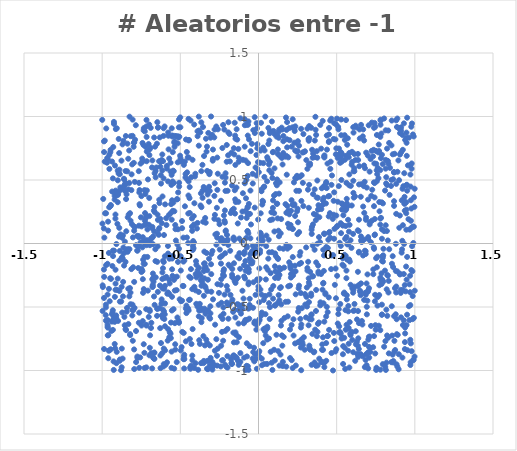
| Category | Y |
|---|---|
| 0.8964167657701791 | -0.99 |
| 0.5824913958309657 | 0.147 |
| -0.10274675420012946 | -0.372 |
| 0.3691181538297885 | -0.149 |
| 0.28324670696125986 | -0.799 |
| -0.22171421234348498 | 0.003 |
| 0.34918489653656937 | 0.389 |
| -0.17051188895530744 | -0.459 |
| 0.9238952145326706 | -0.642 |
| -0.2822801752314581 | 0.375 |
| 0.8907044855774 | -0.72 |
| -0.8305976686521073 | 0.227 |
| -0.8409951767035069 | -0.507 |
| -0.807322820931881 | -0.567 |
| 0.32517920160419833 | -0.822 |
| 0.3483666643932861 | 0.15 |
| 0.18859269846408022 | 0.155 |
| 0.41249743487753876 | -0.739 |
| -0.7141899433687766 | 0.418 |
| 0.6187244401403211 | -0.924 |
| 0.3759309111390634 | 0.675 |
| -0.9930883082792661 | 0.351 |
| 0.6491729342163812 | -0.372 |
| -0.08356164736692451 | -0.138 |
| 0.9300679211641962 | 0.946 |
| -0.6315652358383388 | 0.835 |
| 0.48222065649139334 | -0.704 |
| 0.6133080096440979 | 0.569 |
| 0.3667051522160789 | -0.961 |
| 0.2035934603628089 | -0.182 |
| -0.5369673955765399 | 0.804 |
| 0.8786831464304732 | -0.002 |
| 0.883196828299736 | -0.951 |
| 0.2591799225699525 | 0.77 |
| -0.013596083525351244 | -0.678 |
| 0.5504688796966977 | -0.089 |
| -0.12651882503492629 | 0.644 |
| -0.9883009623744117 | -0.429 |
| 0.11070303346926358 | -0.098 |
| -0.07887533704441974 | 0.043 |
| -0.3742973551315738 | -0.51 |
| -0.4843319749107293 | -0.334 |
| 0.0725126760214021 | 0.868 |
| -0.07067640993851287 | 0.098 |
| 0.5370403599780624 | -0.166 |
| 0.605317040131907 | 0.076 |
| -0.12514234186607442 | -0.738 |
| -0.08646866079407567 | -0.275 |
| 0.9456056375305006 | 0.832 |
| 0.39511078589696513 | 0.934 |
| 0.38011067176742674 | 0.36 |
| 0.6698182500527532 | 0.898 |
| -0.9583727843412482 | -0.844 |
| 0.8503405297641415 | 0.5 |
| 0.8504889129323194 | 0.772 |
| 0.774221274463414 | 0.253 |
| -0.3162615292680615 | -0.12 |
| -0.48768610515749744 | -0.696 |
| -0.9549618778805946 | 0.285 |
| -0.3579383095247284 | 0.36 |
| -0.5499325939312683 | -0.255 |
| -0.5327327922374776 | -0.793 |
| -0.3388243723242108 | -0.553 |
| 0.6434961169008853 | -0.326 |
| 0.10183523932162242 | 0.095 |
| -0.5627692674530562 | -0.71 |
| -0.6340711962837107 | 0.122 |
| 0.15835578605192557 | 0.712 |
| -0.025094971917935638 | -0.08 |
| 0.7804648364997802 | 0.935 |
| -0.9487728963605064 | -0.273 |
| 0.6853964652447091 | -0.061 |
| 0.337240819925559 | 0.911 |
| 0.6317514238363173 | -0.869 |
| -0.7928095482513646 | -0.507 |
| -0.2926758793260462 | 0.652 |
| -0.6639568523584924 | 0.248 |
| -0.5971916382437978 | 0.308 |
| -0.6615615750117056 | 0.763 |
| -0.15849107907487747 | 0.274 |
| 0.007335839017932777 | -0.895 |
| 0.9627912551954012 | 0.834 |
| -0.7543966712906305 | 0.629 |
| -0.84393747633777 | 0.387 |
| -0.10287083286972387 | 0.252 |
| 0.9717009858263721 | -0.957 |
| -0.6434490514446245 | 0.186 |
| 0.1392276410030775 | 0.686 |
| 0.027044977451173846 | 0.024 |
| 0.48063971328940847 | 0.336 |
| -0.32096948367387856 | 0.871 |
| 0.5264749523966377 | -0.019 |
| -0.679641614383711 | 0.045 |
| 0.043442350205074254 | 0.999 |
| 0.06955037132103636 | -0.401 |
| 0.6765241224971563 | 0.241 |
| 0.7628542961505342 | 0.595 |
| 0.24908498842640525 | 0.073 |
| -0.6144139100303507 | -0.354 |
| 0.9223219745454649 | -0.365 |
| 0.3246211734815636 | 0.83 |
| 0.8740951566173507 | -0.839 |
| 0.5193859741150035 | 0.707 |
| 0.28732604027799913 | 0.862 |
| 0.25016039747670815 | 0.274 |
| -0.02397805202246972 | 0.282 |
| -0.06164986680811246 | 0.312 |
| 0.9672042898750175 | 0.11 |
| -0.6225131078402659 | 0.647 |
| 0.49779177937294516 | 0.749 |
| -0.056129465928743016 | -0.436 |
| 0.7523059521893796 | -0.116 |
| -0.5607057680837213 | -0.745 |
| 0.4019824148962772 | 0.271 |
| -0.6112983400584597 | -0.587 |
| 0.8315385610899886 | 0.627 |
| -0.6682483755685384 | -0.417 |
| -0.9540866247145692 | 0.698 |
| 0.6070887278583763 | 0.398 |
| 0.5547149608127939 | -0.988 |
| -0.46722693092133905 | 0.52 |
| 0.12222496752826828 | 0.198 |
| -0.3227080197566423 | -0.526 |
| -0.644663355965515 | -0.023 |
| -0.8185900556492052 | -0.478 |
| 0.23706140394374398 | -0.219 |
| 0.0065282399922172996 | -0.604 |
| -0.2399216684978842 | 0.337 |
| 0.931393501804419 | -0.003 |
| -0.8187582792241554 | -0.387 |
| 0.9095538126255538 | -0.365 |
| 0.3213492444182797 | 0.622 |
| -0.03455759665608826 | -0.506 |
| -0.24049605730190038 | 0.019 |
| 0.3392455855923253 | -0.597 |
| -0.6884425320386056 | 0.039 |
| 0.3400568196866236 | -0.955 |
| -0.9434504935046404 | -0.279 |
| -0.924823353297046 | 0.958 |
| 0.6755869781598753 | 0.811 |
| 0.5998275015271133 | -0.76 |
| -0.9883125063597904 | 0.804 |
| 0.13519273978273816 | 0.481 |
| 0.12052299914682107 | 0.852 |
| 0.9779735240312586 | 0.124 |
| 0.09918770123905762 | 0.377 |
| -0.435249907012621 | -0.986 |
| 0.3288674930298563 | 0.618 |
| 0.9295420257242957 | -0.605 |
| -0.9001491364631893 | 0.325 |
| -0.18537386581072024 | 0.863 |
| -0.23995120559009697 | -0.158 |
| 0.451535298446041 | -0.68 |
| -0.196624817689794 | 0.03 |
| 0.6886809534170801 | 0.716 |
| 0.5730974618087774 | -0.844 |
| 0.6415922519494379 | -0.831 |
| 0.24442729332645574 | 0.723 |
| 0.6911699122497048 | -0.315 |
| -0.26408078939681534 | 0.677 |
| 0.0671436912845973 | -0.47 |
| 0.6428291871940137 | -0.627 |
| -0.2692355782676239 | -0.009 |
| -0.31139358364841807 | -0.803 |
| 0.12802554547599998 | 0.879 |
| 0.5645171030428493 | 0.352 |
| 0.34202270434055726 | 0.131 |
| 0.9974592893503424 | 0.289 |
| -0.018605640688908798 | -0.405 |
| -0.508479818435418 | -0.041 |
| -0.987724723558651 | -0.831 |
| 0.5607188551289555 | 0.27 |
| 0.45110392578803515 | 0.91 |
| 0.7392888823988266 | -0.042 |
| 0.7912500699481027 | -0.291 |
| 0.14347353402208074 | -0.201 |
| 0.1901328270645204 | -0.337 |
| 0.9914435798025683 | -0.914 |
| -0.2264643220439313 | 0.934 |
| -0.10397407882778542 | -0.486 |
| 0.749626408213635 | -0.679 |
| 0.5161769654218562 | -0.652 |
| -0.714838778170577 | 0.026 |
| 0.9049295253086094 | 0.701 |
| -0.5781639886121681 | -0.674 |
| 0.6379587595587204 | -0.893 |
| -0.07442731055949325 | -0.032 |
| -0.5625485123772633 | 0.566 |
| 0.018010504024617013 | 0.425 |
| 0.6556528250006752 | -0.314 |
| -0.2829043765458894 | 0.835 |
| 0.1906918157322941 | 0.257 |
| 0.5946525438108017 | -0.035 |
| -0.9887567014451821 | -0.205 |
| -0.24935849936521115 | 0.152 |
| 0.13384458981056313 | -0.191 |
| -0.1624010349360634 | -0.538 |
| 0.2594673143501689 | 0.415 |
| -0.35723300157250315 | 0.417 |
| -0.6495724894701993 | 0.786 |
| -0.6732113250777163 | 0.056 |
| 0.10431770209608238 | -0.921 |
| 0.36245919303719165 | -0.678 |
| -0.23347280489787114 | -0.696 |
| 0.7445196958170881 | -0.455 |
| -0.13976427917595502 | 0.9 |
| 0.5501256382620054 | 0.297 |
| 0.5711875165277616 | 0.829 |
| 0.5766420871084792 | -0.665 |
| 0.6144220996514456 | -0.34 |
| -0.4194581313955146 | -0.021 |
| 0.4839990497905635 | 0.403 |
| -0.7740355820534481 | -0.901 |
| -0.9202188721372699 | 0.346 |
| 0.6808982749540282 | -0.791 |
| -0.011689824209191624 | 0.948 |
| -0.12268185255907538 | 0.039 |
| 0.22830328036528713 | 0.3 |
| -0.9304335420511718 | -0.099 |
| 0.7887476707398404 | 0.324 |
| 0.05578128912235103 | 0.679 |
| -0.22430116760598873 | -0.217 |
| -0.580737151648199 | -0.765 |
| -0.5762505925039008 | 0.849 |
| -0.2946853378801346 | -0.059 |
| 0.2705757992186051 | -0.39 |
| 0.8236996057444268 | -0.57 |
| -0.5483033725637936 | 0.719 |
| -0.2309277340627165 | 0.526 |
| 0.26763823163209755 | -0.068 |
| -0.3496991548153281 | -0.925 |
| -0.6603822474589898 | 0.59 |
| -0.6673912183340367 | 0.835 |
| -0.0698644378154134 | 0.233 |
| 0.3737069653313092 | -0.73 |
| 0.450553515396368 | 0.859 |
| -0.9067629395507788 | -0.853 |
| -0.2968110670327857 | 0.855 |
| 0.06281954808112844 | -0.119 |
| 0.9466603291171671 | 0.873 |
| 0.017060272858139935 | -0.568 |
| 0.8880537645411353 | -0.969 |
| 0.054826416026197755 | -0.948 |
| -0.07549742641571888 | 0.201 |
| -0.478311113203332 | -0.704 |
| 0.3803870880035145 | -0.632 |
| -0.5554818626110618 | 0.54 |
| 0.2900805465123837 | -0.738 |
| 0.06649458621219528 | 0.623 |
| 0.6757269296818118 | -0.444 |
| -0.7970481711590081 | 0.792 |
| 0.2639261775617223 | 0.525 |
| -0.5165326708203313 | 0.639 |
| 0.10495543217363124 | -0.18 |
| 0.3214107423599455 | 0.809 |
| -0.49671073332258664 | 0.651 |
| 0.7573318445121611 | 0.854 |
| -0.6943480946299625 | -0.013 |
| -0.4708747324666209 | 0.645 |
| 0.5458575157610892 | -0.394 |
| 0.08562373009985147 | 0.961 |
| 0.9472292235554669 | 0.793 |
| 0.3686443207582488 | 0.855 |
| -0.44767719082121915 | 0.981 |
| 0.22986935191350089 | 0.309 |
| 0.7114546982807555 | -0.733 |
| -0.7488652462294276 | -0.224 |
| 0.07759778563582631 | -0.234 |
| 0.224346072792458 | -0.223 |
| 0.8198929346093782 | -0.361 |
| -0.9202124546339121 | 0.375 |
| 0.2079567493694925 | 0.257 |
| -0.026810369041211368 | -0.928 |
| -0.06431430367879942 | 0.961 |
| -0.19809822876411576 | -0.673 |
| -0.8692216435355764 | -0.906 |
| 0.4190575745657501 | 0.446 |
| -0.6716309753937462 | -0.269 |
| 0.727444432194251 | 0.423 |
| 0.4281005063936456 | -0.4 |
| -0.9461961608264853 | 0.738 |
| 0.7344931720199659 | -0.242 |
| 0.915600670959843 | -0.072 |
| 0.20509395053335688 | -0.169 |
| 0.1727975273506297 | 0.31 |
| -0.2176779495979173 | 0.179 |
| -0.497423015775468 | -0.842 |
| 0.6250918872527957 | 0.915 |
| 0.4204953064286696 | -0.935 |
| 0.07524499944177232 | 0.184 |
| 0.7371065584287153 | -0.03 |
| 0.9460015939803528 | 0.267 |
| -0.4127672460320151 | 0.008 |
| -0.052007279152955554 | 0.04 |
| 0.6381902579454499 | -0.746 |
| 0.5160086455489594 | -0.701 |
| 0.18258281063282777 | 0.821 |
| -0.46452640796397393 | -0.77 |
| 0.5419626638884651 | -0.111 |
| -0.8659261820476392 | -0.302 |
| -0.028636277071916405 | -0.821 |
| 0.037573366952292186 | 0.524 |
| -0.018822262862190353 | 0.599 |
| -0.6991431993325081 | 0.937 |
| -0.6470325163815227 | 0.955 |
| -0.06797983374595762 | -0.967 |
| 0.5426676343579451 | 0.223 |
| 0.2269011609570597 | 0.481 |
| -0.8547575150830544 | 0.014 |
| -0.17282585071317902 | 0.715 |
| -0.03673315877145722 | -0.018 |
| 0.8213577180703591 | 0.098 |
| -0.30615980941740295 | 0.833 |
| -0.12660555957938446 | -0.955 |
| -0.84857367746543 | 0.846 |
| 0.4523563187174098 | 0.374 |
| 0.9345296316271341 | 0.313 |
| 0.5074685786038788 | 0.329 |
| -0.7568390918916388 | -0.897 |
| 0.1239298548704475 | 0.741 |
| 0.7344037586584227 | -0.204 |
| 0.7427958585964567 | 0.362 |
| 0.8524254471968253 | -0.494 |
| 0.8494950838026705 | -0.935 |
| -0.8504969508291031 | 0.571 |
| 0.5633229943393006 | -0.64 |
| -0.17738671148250895 | 0.24 |
| -0.30803366184432335 | -0.494 |
| 0.49321984940471353 | -0.197 |
| 0.060309910490006 | 0.663 |
| -0.8874559105107824 | -0.059 |
| 0.8890558035864846 | 0.565 |
| -0.1270927268009543 | -0.482 |
| 0.04618118730545451 | -0.724 |
| -0.9185782015888855 | -0.42 |
| 0.45433612602059004 | 0.091 |
| -0.6429831028663646 | 0.912 |
| 0.9507566461687129 | 0.99 |
| -0.22691173068752546 | -0.246 |
| -0.5325146382619739 | 0.146 |
| 0.09458126631659902 | -0.335 |
| -0.13587034885404958 | -0.478 |
| 0.9027850908676878 | 0.905 |
| -0.6875923388386644 | -0.665 |
| 0.42076148062109686 | 0.075 |
| -0.7481302461303698 | -0.646 |
| 0.4332142989236314 | -0.924 |
| 0.6930985936712546 | -0.558 |
| 0.6293702196292907 | -0.773 |
| -0.5127719457977851 | 0.835 |
| 0.15935546166166947 | 0.846 |
| -0.36583140130796044 | 0.954 |
| 0.07787754782186895 | -0.852 |
| -0.3684355807670172 | 0.395 |
| -0.06484823909015947 | -0.513 |
| -0.8130724242601941 | 0.42 |
| -0.6337285327451174 | -0.509 |
| -0.4585655392053438 | 0.721 |
| -0.8751876553710385 | -0.975 |
| -0.3820039722494506 | -0.574 |
| 0.7122922570455443 | 0.167 |
| -0.37909804392776447 | -0.761 |
| 0.46711184983196996 | -0.863 |
| -0.5284415443440114 | 0.024 |
| 0.5647371145059599 | -0.44 |
| 0.9733837362307343 | -0.935 |
| -0.864191074651927 | -0.032 |
| -0.4234692476430755 | -0.883 |
| 0.3806789046340546 | 0.266 |
| -0.2654975295382298 | -0.884 |
| 0.6810325001495825 | 0.593 |
| -0.6478842505873377 | -0.145 |
| -0.3980196345465232 | -0.475 |
| -0.7010170007467711 | 0.148 |
| -0.9761666930675519 | -0.607 |
| -0.6046185616760307 | -0.534 |
| 0.8630161477623335 | -0.926 |
| -0.14793562854792253 | -0.583 |
| -0.7385028746476641 | -0.389 |
| 0.36030916943281044 | 0.811 |
| -0.6185500525799348 | 0.16 |
| 0.7392780383627493 | -0.729 |
| -0.552036204843904 | -0.118 |
| 0.4583288745370866 | 0.045 |
| -0.3277620371791312 | -0.21 |
| -0.1410113447398489 | 0.441 |
| -0.696651907510341 | -0.522 |
| -0.21473586282756818 | 0.479 |
| 0.03898251097829819 | 0.733 |
| 0.8805150323515718 | 0.97 |
| 0.08679694997348641 | -0.069 |
| -0.16790113059617306 | -0.201 |
| -0.6100470774312334 | -0.136 |
| -0.6160528502475879 | -0.863 |
| 0.11707365428985406 | 0.313 |
| 0.4331742316871796 | 0.484 |
| -0.8722483078549366 | 0.045 |
| -0.7151412271483215 | 0.648 |
| 0.4957602177405971 | -0.431 |
| 0.005109518867287388 | -0.848 |
| 0.25942408467471556 | -0.332 |
| 0.6060405067274095 | -0.856 |
| -0.2093338213628413 | 0.103 |
| -0.2822913652190515 | 0.194 |
| -0.5861592426983562 | 0.59 |
| 0.6062337748370286 | 0.916 |
| -0.39011823382729793 | 0.884 |
| -0.8505556389148703 | -0.145 |
| -0.41131920662563104 | 0.937 |
| -0.42144306143288457 | -0.674 |
| 0.3365999491761502 | -0.395 |
| -0.47501976072936447 | -0.876 |
| 0.02080178364996521 | -0.907 |
| 0.5135923078918738 | 0.452 |
| 0.08864971734271232 | 0.247 |
| 0.21892647276206612 | -0.981 |
| 0.9362614120675739 | -0.831 |
| -0.9738633957997942 | 0.906 |
| 0.8809456065040027 | 0.233 |
| -0.7165193627662734 | 0.973 |
| -0.643945417712916 | -0.381 |
| -0.9981757211398539 | 0.157 |
| 0.5339391496887291 | 0.267 |
| 0.33710206002895315 | -0.412 |
| -0.5423835675071353 | 0.476 |
| 0.9119360572553548 | 0.915 |
| 0.81336567298506 | 0.589 |
| -0.8011050077965076 | -0.524 |
| 0.7560662212932792 | 0.576 |
| 0.9710889533293914 | -0.485 |
| 0.8549771794365013 | -0.725 |
| 0.4106607317251787 | 0.965 |
| 0.7468996282881035 | 0.919 |
| -0.24130981529653783 | -0.574 |
| 0.48459687416422303 | -0.768 |
| 0.1780002403859744 | -0.97 |
| 0.6695412129194047 | 0.291 |
| 0.8137870839083718 | 0.659 |
| 0.13400218685692367 | -0.961 |
| 0.45069236185182127 | 0.805 |
| -0.9149341594329234 | 0.228 |
| 0.2690384377794166 | -0.764 |
| -0.050406600690413805 | -0.142 |
| -0.3797732677521397 | -0.527 |
| -0.9369967119394103 | -0.615 |
| -0.9340809533880488 | -0.544 |
| -0.8331521293594415 | 0.667 |
| -0.3523781992580197 | -0.73 |
| -0.45007245487133885 | 0.003 |
| -0.8209014455750736 | -0.721 |
| 0.7796482758872882 | -0.994 |
| -0.6794670495904724 | -0.282 |
| -0.34274299025393073 | -0.803 |
| 0.21697012811349947 | -0.251 |
| -0.4100254492871169 | -0.341 |
| -0.5223133305880476 | 0.349 |
| 0.22098926023153842 | -0.251 |
| -0.4647422052399919 | -0.513 |
| 0.2599609711234152 | 0.09 |
| -0.7180056631860248 | 0.921 |
| 0.11526587278683653 | 0.842 |
| -0.8870909711977262 | 0.546 |
| 0.79777127970542 | -0.093 |
| 0.9509834251108011 | 0.416 |
| 0.8591391462629858 | -0.93 |
| 0.09392187394195028 | 0.721 |
| -0.8904054889866451 | -0.136 |
| 0.6859856131122237 | -0.403 |
| 0.31266214088396205 | -0.193 |
| -0.3550095245208349 | 0.918 |
| -0.14676761083525935 | -0.898 |
| -0.5988822636954076 | -0.1 |
| 0.6001436598367629 | -0.353 |
| 0.7661303004195863 | 0.717 |
| -0.15883163546562518 | 0.04 |
| 0.8258918142674965 | 0.65 |
| 0.7788843911610683 | 0.578 |
| 0.010084864430043083 | -0.053 |
| -0.08771337516425359 | 0.979 |
| -0.8510403843823582 | 0.464 |
| 0.016260131769739283 | 0.416 |
| 0.2420788396218816 | 0.794 |
| -0.7105797660154556 | -0.106 |
| -0.9064527724425251 | 0.907 |
| -0.1689721287207937 | 0.456 |
| -0.40640928426058176 | 0.528 |
| -0.22109852877908187 | 0.221 |
| -0.37005181827748834 | -0.253 |
| 0.3961286464252758 | -0.463 |
| 0.07324563953063756 | -0.501 |
| -0.9450105785386906 | 0.303 |
| 0.9382889538986232 | 0.815 |
| 0.919725724746443 | 0.021 |
| -0.7913304677095401 | 0.485 |
| 0.5450461551028145 | -0.177 |
| -0.08811235112454785 | 0.763 |
| 0.9747181668857592 | 0.34 |
| 0.4427013065641059 | -0.541 |
| -0.5681646125158022 | -0.314 |
| -0.571844300997675 | -0.285 |
| 0.7620503213674241 | -0.422 |
| 0.7948954854764669 | -0.113 |
| 0.4586371119840267 | 0.968 |
| 0.18071026134127077 | 0.542 |
| -0.31660640591530975 | -0.922 |
| 0.5259761480981928 | 0.679 |
| -0.8609942539578164 | 0.434 |
| 0.12305023809821813 | -0.249 |
| -0.43948070338586387 | 0.24 |
| 0.9464136419825959 | 0.459 |
| 0.979922613404326 | 0.63 |
| -0.13880207660723531 | -0.777 |
| 0.8033876525174837 | 0.098 |
| -0.15677807066478877 | -0.156 |
| 0.6299148318297043 | -0.598 |
| 0.5219083419720381 | 0.69 |
| 0.8847131039889795 | -0.714 |
| -0.9270256382475639 | -0.928 |
| 0.21179935284190798 | -0.642 |
| 0.7948928114475065 | -0.95 |
| -0.0005174325531944746 | -0.338 |
| 0.9982329185604115 | -0.89 |
| -0.9621619892250364 | 0.172 |
| -0.7236531415024388 | 0.389 |
| -0.15717564523069516 | -0.779 |
| -0.8869004441292558 | -0.458 |
| 0.5514410348630954 | 0.853 |
| 0.5670072679665032 | -0.127 |
| -0.6138905210131422 | 0.37 |
| -0.06867506311998506 | 0.289 |
| 0.2341428427593506 | -0.787 |
| -0.5022016481249132 | 0.647 |
| -0.18164157056874064 | -0.179 |
| -0.14724640219664753 | -0.7 |
| 0.8999899992575304 | 0.906 |
| -0.6268443693966297 | -0.981 |
| -0.8669541665038705 | 0.064 |
| -0.7402148473968939 | -0.611 |
| -0.41711150345104975 | 0.007 |
| -0.7829572416872135 | -0.934 |
| -0.9237257752951376 | -0.056 |
| 0.7894442808111102 | 0.698 |
| -0.9652189916386049 | -0.638 |
| 0.3679121624139905 | 0.226 |
| -0.18680477107283178 | -0.483 |
| 0.9881072289295734 | 0.133 |
| -0.036707123320436574 | 0.473 |
| -0.9253253760656301 | -0.581 |
| 0.8480038993458421 | 0.453 |
| 0.7568337708159603 | 0.49 |
| -0.9145002690745421 | -0.365 |
| 0.6848598625849742 | -0.917 |
| -0.20550882664268566 | -0.971 |
| 0.40933786150386275 | -0.363 |
| -0.3466567378035932 | -0.196 |
| -0.7290718114365096 | -0.106 |
| -0.5169336538050762 | 0.789 |
| -0.07020761634765993 | -0.186 |
| 0.779232503330842 | 0.148 |
| -0.735143350504692 | 0.018 |
| 0.21148432049693477 | 0.341 |
| 0.05486818178950936 | 0.49 |
| -0.32946612297354383 | 0.763 |
| 0.2712962102504288 | -0.819 |
| -0.9025665249635069 | 0.154 |
| -0.011443323840324204 | -0.64 |
| 0.6354962273214304 | -0.805 |
| -0.8949100925174127 | 0.562 |
| -0.6978038028952462 | 0.696 |
| 0.5410972302249726 | -0.948 |
| 0.42134505054122817 | 0.455 |
| -0.5158924415501984 | 0.844 |
| 0.538547668531344 | 0.306 |
| 0.23500806047091016 | 0.515 |
| -0.12357407302215218 | -0.116 |
| 0.6129991275785933 | -0.527 |
| -0.7482367381643342 | 0.135 |
| 0.09164960701089564 | 0.719 |
| -0.5711576949306632 | 0.669 |
| 0.0378760776626319 | -0.948 |
| -0.07728631248121509 | 0.501 |
| -0.9974187056992567 | -0.531 |
| -0.07387884921342058 | -0.889 |
| -0.9125502533620131 | 0.901 |
| -0.8368553510880476 | -0.065 |
| -0.51217127390386 | -0.607 |
| -0.9608088082622921 | -0.722 |
| -0.1928945449945043 | 0.875 |
| 0.3601830753140829 | 0.68 |
| -0.22074815691516436 | -0.255 |
| 0.24232287362288796 | 0.415 |
| -0.4744470262835989 | -0.91 |
| -0.021348883184223677 | -0.043 |
| -0.9892003851600837 | 0.119 |
| -0.9316152479386002 | -0.056 |
| -0.6674822045023785 | 0.095 |
| 0.5627312187956937 | 0.052 |
| 0.3309930237454939 | -0.588 |
| 0.6613252262323221 | -0.61 |
| -0.9567810136030797 | -0.357 |
| -0.11594393815959148 | -0.863 |
| 0.19556504180280854 | 0.124 |
| -0.08948158828959918 | -0.065 |
| 0.9531140643515783 | -0.84 |
| -0.9144032196506608 | -0.316 |
| 0.7152548290908114 | -0.823 |
| 0.17177622447550722 | 0.684 |
| -0.5150028404813136 | -0.145 |
| -0.5944771738029115 | -0.955 |
| -0.6065640662365985 | 0.908 |
| 0.9489832096138759 | 0.463 |
| -0.3143544166185017 | 0.546 |
| -0.8929680612767708 | 0.054 |
| -0.6073507720842559 | -0.968 |
| 0.7888213006245504 | -0.561 |
| 0.6927669460239305 | -0.499 |
| 0.019186229750277617 | 0.412 |
| 0.9265934091312604 | 0.451 |
| 0.23297472316979384 | -0.175 |
| -0.4550150420172667 | 0.504 |
| -0.666960888827639 | -0.862 |
| 0.016136829299628452 | 0.95 |
| -0.41014073359855563 | 0.317 |
| -0.8501936063399427 | 0.476 |
| -0.21068005909550136 | 0.553 |
| 0.4668993303880007 | 0.462 |
| -0.9200682598398215 | -0.617 |
| -0.3021906825777827 | -0.241 |
| 0.7365087447228127 | 0.738 |
| -0.4393977512309153 | -0.442 |
| -0.06209689986001177 | -0.226 |
| -0.18104214035893307 | -0.057 |
| 0.464354344782409 | -0.202 |
| 0.7817998899749501 | 0.968 |
| -0.5461507601316169 | 0.573 |
| 0.23380023840410424 | 0.217 |
| 0.11757316411706631 | 0.458 |
| 0.7905290613231455 | -0.138 |
| 0.3490313603282449 | -0.258 |
| 0.5029119091410574 | -0.255 |
| 0.6129695649582276 | 0.705 |
| -0.8998369896984093 | 0.498 |
| 0.7388170707605144 | 0.294 |
| 0.1469993696836034 | -0.609 |
| -0.6684277830781455 | -0.907 |
| -0.42373912791282176 | -0.359 |
| 0.4060936903909276 | -0.837 |
| -0.5319297496203834 | -0.836 |
| 0.2741144471137016 | -0.638 |
| -0.4257530501537905 | 0.132 |
| 0.3048548116418044 | -0.031 |
| 0.38379201893222614 | 0.302 |
| 0.8885997751112134 | -0.22 |
| -0.554316082728215 | -0.528 |
| 0.6358855996901813 | -0.223 |
| -0.39383272242527 | 0.118 |
| 0.813858908494814 | 0.144 |
| -0.6194040446138531 | 0.657 |
| -0.311902521908511 | 0.414 |
| -0.09089615154348296 | -0.62 |
| 0.44351903227973577 | -0.728 |
| -0.4977250319928057 | -0.101 |
| 0.21472286917499828 | -0.242 |
| 0.25617520904241253 | 0.685 |
| 0.9120255084948219 | -0.582 |
| 0.9709340698931765 | -0.758 |
| 0.476588724629899 | -1 |
| 0.6427611748849296 | -0.065 |
| -0.4969822882893884 | -0.213 |
| 0.8580187578825527 | -0.875 |
| 0.04935288216916289 | -0.021 |
| 0.4753702897288865 | 0.194 |
| -0.15584586049832572 | 0.027 |
| -0.4802687863435764 | -0.143 |
| 0.41941472586161743 | -0.941 |
| 0.2184744010530837 | 0.307 |
| 0.5211746371243391 | -0.697 |
| -0.9289737321968796 | 0.76 |
| -0.8630184156650051 | -0.079 |
| 0.01551655347164127 | 0.072 |
| -0.3414425247596513 | -0.539 |
| 0.9379372469506504 | -0.708 |
| -0.752372670975096 | 0.206 |
| -0.09245973452141953 | -0.17 |
| 0.14075999860350263 | -0.875 |
| -0.894703151709656 | 0.55 |
| 0.2712250997992134 | -0.662 |
| 0.23150196636564413 | 0.886 |
| 0.9005119692752708 | 0.124 |
| -0.5777481683670456 | 0.874 |
| -0.19124459953416717 | -0.167 |
| 0.7526106607460064 | -0.996 |
| -0.25711200076754026 | 0.183 |
| 0.2675922189328397 | -0.594 |
| 0.7069141244315122 | -0.352 |
| 0.8188201176707823 | -0.938 |
| -0.7428480850142114 | 0.643 |
| -0.16892623285400798 | 0.262 |
| -0.21717133005994205 | -0.402 |
| -0.2775303601877599 | -0.639 |
| 0.44985391338196656 | 0.799 |
| 0.5065556885934128 | 0.674 |
| -0.5551142726492551 | 0.188 |
| -0.44395429669949227 | -0.444 |
| -0.8173747456677811 | 0.845 |
| 0.49656697655902704 | 0.937 |
| -0.7629286881628974 | -0.545 |
| -0.7896043693076769 | 0.817 |
| -0.054592588229680716 | 0.233 |
| -0.8692509612953956 | -0.117 |
| 0.833057358009581 | -0.295 |
| -0.033171665520645766 | 0.893 |
| 0.3728856806415528 | 0.727 |
| 0.15866478361815806 | 0.805 |
| -0.15504834714157978 | 0.701 |
| -0.04816678988236878 | 0.15 |
| 0.5964511711144105 | 0.299 |
| -0.303476921122495 | -0.163 |
| 0.9773477377844828 | -0.209 |
| 0.33007930082826054 | -0.833 |
| -0.6885214873538494 | -0.003 |
| 0.7931379389070288 | -0.288 |
| -0.3376462205757902 | 0.163 |
| -0.8704512321772511 | -0.12 |
| 0.1289510061151622 | -0.406 |
| 0.5615215794514501 | 0.288 |
| 0.20568412887029175 | -0.197 |
| -0.7834171407381005 | -0.689 |
| 0.8036637373706166 | 0.984 |
| -0.811677057898216 | 0.545 |
| 0.6432105421633132 | 0.465 |
| 0.4499877016032201 | 0.084 |
| 0.2187763812589394 | 0.978 |
| -0.9749096892776401 | -0.17 |
| 0.4079262124726779 | -0.795 |
| -0.7629715361309453 | -0.979 |
| -0.05011018080099894 | 0.727 |
| -0.32941554834082254 | -0.986 |
| 0.16127743082193313 | -0.736 |
| 0.8361098409581329 | -0.045 |
| -0.26039713864297687 | 0.549 |
| 0.4213412812286528 | -0.973 |
| -0.914582723210422 | -0.206 |
| 0.97488534074191 | 0.179 |
| 0.8670071056059538 | 0.333 |
| -0.4319960592200913 | -0.202 |
| -0.3255174033444517 | 0.386 |
| -0.11168132289013033 | 0.205 |
| 0.3128365506746553 | 0.588 |
| -0.678760582626744 | 0.654 |
| 0.4414851792371719 | 0.63 |
| -0.16930010262895911 | -0.947 |
| 0.7959352241926165 | 0.316 |
| -0.7355148456489256 | 0.776 |
| 0.7791508709177495 | 0.84 |
| 0.1831298860546704 | 0.757 |
| 0.5255989519396707 | 0.16 |
| 0.13371914958708908 | -0.447 |
| 0.8264617388170719 | 0.65 |
| -0.19857329114564948 | -0.887 |
| 0.43137613176015543 | 0.315 |
| 0.08400005977749858 | 0.556 |
| -0.6456908643404291 | 0.227 |
| -0.7751408911202238 | -0.89 |
| 0.3312528621874784 | -0.836 |
| 0.25740510103659786 | -0.508 |
| 0.36416168204090216 | 0.998 |
| -0.8364036639437324 | 0.206 |
| 0.5417502699742962 | -0.808 |
| 0.2837858497352952 | 0.477 |
| -0.4522479004560356 | 0.679 |
| -0.12190192848211079 | -0.076 |
| -0.5185565214886152 | -0.008 |
| 0.21271609517285262 | 0.763 |
| 0.8727887363459894 | -0.352 |
| 0.9816903346759538 | 0.945 |
| 0.3763769589223347 | 0.496 |
| 0.8781106314967801 | -0.216 |
| 0.6413447658299085 | 0.098 |
| 0.17834131284313615 | 0.242 |
| -0.6753415278895063 | -0.236 |
| 0.4981322571827287 | 0.22 |
| 0.6202817537452796 | 0.658 |
| 0.9054727634152164 | 0.869 |
| -0.9762417478449896 | -0.503 |
| -0.48846217814783777 | 0.121 |
| -0.8380344231209542 | -0.045 |
| -0.3971127294300143 | -0.168 |
| -0.40243006509931556 | -0.369 |
| -0.39954917797976286 | -0.139 |
| 0.8385241443867233 | 0.383 |
| -0.6148618138976598 | -0.228 |
| 0.3132122329832421 | -0.213 |
| -0.6645062075528851 | 0.553 |
| 0.10238170304938565 | 0.591 |
| -0.05614335047625474 | -0.118 |
| 0.5112433559714222 | 0.899 |
| 0.7061365615900999 | -0.735 |
| -0.4032442404223511 | -0.942 |
| -0.6111381634600246 | -0.195 |
| -0.34103929901878405 | 0.201 |
| 0.055812620863866735 | -0.756 |
| -0.6979527407890076 | 0.216 |
| -0.09975893793426427 | 0.396 |
| 0.1525567907155594 | -0.805 |
| -0.0944764366390336 | -0.628 |
| -0.5526836359650011 | -0.203 |
| -0.9505101153948379 | 0.291 |
| 0.4049011059005352 | 0.435 |
| -0.6893879723518765 | 0.91 |
| 0.11500047420038118 | -0.719 |
| -0.6416488549714319 | 0.915 |
| 0.9342802598006565 | 0.367 |
| -0.5229309437175134 | -0.934 |
| -0.1452429326127116 | 0.327 |
| 0.6417671163737724 | -0.071 |
| -0.3360408800197363 | 0.825 |
| 0.6914578638765907 | -0.958 |
| -0.7654549175198844 | -0.624 |
| -0.7147492598887071 | 0.724 |
| 0.8224639549460693 | 0.747 |
| 0.9356867006118146 | -0.328 |
| -0.48035823515179454 | 0.046 |
| 0.00951929689600961 | -0.073 |
| -0.3818846200130992 | -0.382 |
| -0.44646775986671794 | 0.811 |
| 0.9204825326741315 | -0.898 |
| 0.4198312865181586 | 0.685 |
| -0.5697014418642006 | -0.399 |
| 0.4151307038746743 | -0.31 |
| 0.7422310010587634 | 0.949 |
| -0.5532269270701609 | -0.42 |
| 0.2825137064315706 | 0.716 |
| 0.7794079781698 | -0.269 |
| -0.1938526497182338 | -0.011 |
| -0.809309543381266 | 0.152 |
| 0.9443244824642689 | -0.182 |
| 0.6746624283561757 | 0.031 |
| 0.418839610810271 | -0.094 |
| -0.38935534882275724 | 0.845 |
| -0.1581019339062273 | -0.881 |
| -0.33217059095488 | 0.724 |
| -0.6122405942438369 | -0.521 |
| 0.7015477065767817 | 0.05 |
| 0.7476658699019489 | -0.643 |
| -0.007670071567888126 | 0.782 |
| -0.5387579803813725 | 0.794 |
| -0.4753277928544317 | -0.984 |
| -0.14704840049380508 | 0.825 |
| 0.9507975923620124 | -0.106 |
| -0.707635249275895 | -0.371 |
| -0.659793318241348 | -0.045 |
| 0.07311149926482274 | 0.887 |
| 0.7979787727876899 | -0.3 |
| 0.40346904491671065 | -0.933 |
| -0.6248286458588628 | 0.538 |
| -0.2644990514117169 | -0.961 |
| -0.26629403690075626 | 0.281 |
| 0.617110758585713 | 0.372 |
| -0.20270525813885154 | -0.464 |
| -0.46374409766660696 | 0.819 |
| 0.8670545022587788 | 0.559 |
| 0.37715749170254176 | -0.696 |
| 0.7108198785450379 | 0.566 |
| 0.005223741779035063 | -0.597 |
| -0.2600042419866848 | 0.899 |
| -0.14891240087397994 | 0.348 |
| -0.19800266776419795 | -0.977 |
| -0.9344168318353527 | -0.177 |
| 0.6754050171153825 | 0.614 |
| 0.02966578705511247 | 0.755 |
| -0.8015121849550197 | -0.187 |
| -0.7694435206965113 | -0.193 |
| 0.9482720027233758 | 0.69 |
| -0.6279461100438928 | 0.642 |
| 0.20518148297317906 | 0.146 |
| -0.023950203030791872 | -0.614 |
| 0.5336887858877266 | 0.646 |
| 0.7438557838545976 | 0.193 |
| 0.7109762117169462 | 0.15 |
| -0.2913141201126608 | 0.74 |
| -0.23685118462576815 | -0.467 |
| -0.02421663404357921 | -0.622 |
| 0.6559523270721077 | 0.934 |
| -0.6849321683469325 | -0.863 |
| -0.5149179069478482 | 0.112 |
| -0.6974387622096085 | 0.74 |
| -0.3540603719973412 | 0.171 |
| 0.9697442123176587 | -0.254 |
| -0.017665580795609204 | -0.908 |
| 0.8312864423477153 | -0.386 |
| 0.031786754152338004 | -0.676 |
| 0.40045062545525134 | -0.24 |
| 0.18526939798563524 | -0.041 |
| -0.3518599472178101 | -0.942 |
| 0.6460705429324847 | 0.898 |
| -0.8789597444037316 | 0.424 |
| -0.1791404815254427 | -0.405 |
| 0.5743975326930595 | -0.534 |
| 0.8710896501885026 | 0.707 |
| -0.9406880382590932 | -0.689 |
| 0.5346007964353432 | 0.703 |
| 0.8811811290319425 | 0.47 |
| -0.600389812116976 | 0.922 |
| 0.5672945078957521 | 0.778 |
| -0.15756835870302166 | 0.75 |
| 0.14513557725345194 | 0.193 |
| -0.628892638564073 | -0.666 |
| 0.03322411999962216 | -0.445 |
| -0.29387348741248864 | -0.972 |
| -0.5392491363632705 | -0.985 |
| 0.028811970519756258 | 0.328 |
| -0.734724779429504 | -0.159 |
| 0.90565652582311 | -0.239 |
| 0.13522993955031315 | -0.037 |
| 0.201992185951003 | -0.902 |
| 0.17586775108481612 | 0.992 |
| 0.7331428584664226 | 0.686 |
| -0.003238773674678619 | 0.641 |
| -0.15221669568922613 | 0.951 |
| -0.8328274223111831 | -0.356 |
| -0.5276627263677129 | 0.845 |
| -0.6952656755046829 | -0.821 |
| -0.7257046907890772 | 0.239 |
| -0.2788494412080129 | 0.225 |
| 0.0809456900544323 | -0.362 |
| 0.10633542118404127 | -0.489 |
| 0.9717227761441507 | 0.543 |
| 0.3250083547150233 | -0.804 |
| -0.9058470298626444 | 0.381 |
| -0.05159773063948059 | 0.417 |
| -0.6024699120682291 | -0.594 |
| -0.7906534745265785 | 0.129 |
| 0.519461324715178 | 0.005 |
| 0.7721382508652552 | -0.406 |
| 0.8272117523180365 | 0.024 |
| -0.8322195415088636 | -0.634 |
| 0.03861501828710012 | -0.419 |
| 0.5564608454182287 | -0.525 |
| -0.44117252049540223 | 0.357 |
| 0.6064668315337021 | 0.494 |
| -0.6935046783686567 | -0.723 |
| -0.537313320995956 | 0.847 |
| 0.5726942337963805 | 0.297 |
| 0.12517556456337187 | -0.122 |
| 0.7411275010531277 | 0.631 |
| 0.7187720105144229 | 0.01 |
| -0.5074215693502642 | 0.449 |
| -0.2696146637085024 | -0.753 |
| 0.7859094922020247 | 0.866 |
| -0.07012365271859378 | 0.282 |
| 0.6122578143723616 | 0.593 |
| -0.47056643247528984 | 0.293 |
| 0.7385453060491922 | 0.481 |
| 0.5833028169321699 | -0.618 |
| 0.701497482321991 | -0.369 |
| 0.7729959483517392 | -0.329 |
| -0.323136705282546 | -0.99 |
| 0.9378540467504706 | -0.662 |
| -0.2948648617548517 | -0.993 |
| 0.7696503913847248 | -0.647 |
| 0.34467921487547826 | -0.712 |
| 0.27232228031458683 | -0.153 |
| -0.47743989125369146 | -0.891 |
| -0.957037240987239 | -0.074 |
| -0.7344427174377233 | 0.016 |
| -0.3708909972934895 | 0.3 |
| -0.7270463809304628 | 0.18 |
| 0.8299010125553106 | 0.89 |
| 0.5728934313306728 | 0.187 |
| -0.9314108478993244 | -0.68 |
| -0.14322006989198188 | -0.719 |
| 0.04469813738500328 | -0.557 |
| -0.14366676230967323 | -0.286 |
| -0.46120635755396777 | -0.489 |
| 0.7025168326085591 | -0.757 |
| 0.32127683098817106 | -0.275 |
| -0.21211452168097078 | -0.688 |
| 0.6879288350814081 | -0.873 |
| -0.9760467662687053 | -0.482 |
| 0.5223075645133513 | 0.636 |
| -0.7952614880856714 | 0.1 |
| 0.35875683162842 | -0.937 |
| 0.49761352156065963 | -0.832 |
| 0.02137260881577374 | -0.544 |
| -0.21130487358962302 | 0.414 |
| -0.30744902021988607 | -0.55 |
| 0.5316182622661334 | -0.748 |
| -0.5422272328738706 | 0.57 |
| 0.7516892404699953 | 0.729 |
| -0.19251529017194047 | -0.592 |
| -0.6802134254945451 | -0.983 |
| 0.5679243227976754 | -0.007 |
| 0.41075680450372287 | 0.305 |
| -0.26077214147618366 | -0.828 |
| 0.8177644053984012 | -0.521 |
| -0.3592208121034046 | -0.31 |
| -0.026262717243500155 | -0.628 |
| -0.7755745255078494 | 0.061 |
| -0.0827613875948745 | 0.654 |
| -0.8397676127806746 | 0.569 |
| -0.16896449479596654 | -0.246 |
| -0.6989661369671016 | 0.358 |
| 0.06924205061279354 | 0.576 |
| 0.5530294072605635 | 0.66 |
| -0.44011215504971957 | 0.445 |
| 0.20737066208888333 | -0.268 |
| -0.6715395398595818 | -0.301 |
| 0.3128789467911057 | 0.905 |
| -0.9645504515859482 | 0.665 |
| -0.7161662188852209 | -0.646 |
| -0.7299551589468669 | -0.861 |
| 0.32547934617640895 | -0.596 |
| 0.580897327872191 | 0.713 |
| 0.41592865038732985 | -0.471 |
| 0.4204148998384405 | 0.079 |
| -0.05650706653667492 | -0.484 |
| -0.9166562252405259 | -0.825 |
| 0.33741524812097423 | -0.562 |
| -0.8910977201224488 | 0.712 |
| -0.590638347753099 | 0.199 |
| -0.4465337693618465 | 0.677 |
| 0.1339950782921615 | -0.247 |
| -0.2759930906944805 | 0.071 |
| 0.746524808170024 | -0.866 |
| 0.8356558513854595 | 0.792 |
| -0.808115506805956 | 0.623 |
| 0.8587891296994461 | 0.702 |
| -0.44436370791168933 | 0.815 |
| -0.14328764841564023 | -0.896 |
| -0.1830117114251666 | 0.647 |
| 0.06526119697478139 | 0.03 |
| 0.19641660247945247 | 0.909 |
| 0.36938357711686876 | -0.962 |
| -0.5831881360766875 | -0.396 |
| 0.04706607847796773 | -0.283 |
| -0.8051106379324116 | 0.975 |
| -0.33817129457954986 | -0.185 |
| -0.1526260102253172 | -0.295 |
| 0.24634127047066579 | 0.533 |
| -0.0007248284353491563 | -0.624 |
| 0.034882481785205144 | 0.445 |
| -0.5448180718034696 | 0.322 |
| 0.5887931747354636 | 0.025 |
| -0.2631864186807371 | 0.422 |
| -0.7847961385566602 | 0.931 |
| 0.15588953560277363 | -0.932 |
| -0.3724705366385159 | 0.876 |
| -0.7947163239313015 | -0.989 |
| 0.22002796398686475 | 0.114 |
| -0.9526601138797481 | -0.841 |
| 0.9099884871528026 | -0.389 |
| 0.39362087342699237 | 0.01 |
| -0.07848064941172073 | 0.934 |
| -0.4918725096170957 | -0.816 |
| 0.38314294355809153 | -0.222 |
| 0.21769612679692485 | 0.915 |
| -0.7437002177103689 | 0.669 |
| -0.7278941198561175 | 0.146 |
| -0.7606882744453247 | 0.421 |
| 0.18475657945044488 | 0.295 |
| 0.32029178026285865 | -0.644 |
| 0.656121115309519 | 0.024 |
| -0.06354743174020405 | 0.231 |
| 0.6077227959664067 | 0.873 |
| -0.8836591811882879 | 0.442 |
| -0.2282051349227172 | 0.028 |
| 0.12631378988630004 | -0.848 |
| -0.0994326925287965 | 0.659 |
| -0.49859539200369407 | 0.67 |
| 0.06926798033054182 | 0.811 |
| -0.8783306942211335 | -0.457 |
| -0.380513522127256 | 0.889 |
| -0.8494801212677032 | 0.474 |
| -0.9374629760214066 | -0.556 |
| 0.021359986763129557 | -0.001 |
| 0.1118228114199673 | 0.475 |
| -0.6489811353689048 | -0.57 |
| -0.8793273158708341 | -0.998 |
| -0.715553389329707 | 0.839 |
| -0.312225153117649 | 0.563 |
| 0.44949176364083687 | -0.424 |
| 0.012323090388379976 | -0.362 |
| 0.9043967274276485 | 0.22 |
| 0.8225546563548221 | -0.724 |
| -0.2184953738010713 | 0.897 |
| -0.3061736589721311 | -0.901 |
| 0.5801928768383153 | 0.458 |
| 0.21248706496966596 | -0.919 |
| -0.7348875995864599 | 0.891 |
| -0.6020333075969084 | -0.272 |
| 0.2730341191296344 | -0.998 |
| 0.5303197808131994 | 0.5 |
| -0.9969984481551086 | -0.329 |
| -0.8739968709067947 | -0.109 |
| -0.6061360104191271 | -0.95 |
| 0.15892839705445283 | -0.041 |
| -0.6745247048278613 | -0.899 |
| 0.6529605223173505 | -0.871 |
| -0.3797462137514973 | -0.238 |
| -0.19426323161784276 | 0.695 |
| 0.5598705268794963 | 0.276 |
| 0.9504304036544631 | -0.561 |
| 0.5889254147499468 | -0.721 |
| -0.3121338845266888 | -0.961 |
| -0.315217938255935 | -0.581 |
| 0.9927748802408702 | 0.843 |
| -0.9039262573844915 | -0.366 |
| -0.34929131793726387 | -0.217 |
| 0.5991970289403921 | 0.642 |
| -0.24569987461703868 | -0.108 |
| 0.29749022976543804 | 0.726 |
| 0.9697782156569505 | -0.383 |
| -0.6660328443415464 | -0.858 |
| -0.07472886910053367 | -0.786 |
| 0.6965244758856144 | -0.451 |
| -0.20239558601183738 | 0.021 |
| -0.15924064906033242 | 0.047 |
| 0.5263408363934665 | -0.709 |
| -0.010425204811505218 | -0.987 |
| 0.8618443212408151 | -0.936 |
| 0.38707793974499927 | 0.05 |
| -0.038987135727274635 | -0.142 |
| 0.2744365509948865 | 0.335 |
| 0.46559874731168205 | 0.982 |
| 0.9821608312324943 | -0.021 |
| 0.8095312386351645 | 0.417 |
| 0.1051238766496505 | -0.486 |
| 0.3536990760183625 | -0.857 |
| -0.3455704744853165 | -0.275 |
| 0.7612077525367344 | -0.103 |
| 0.2295028982055629 | 0.901 |
| 0.0895162132404943 | 0.189 |
| -0.32363172077298863 | -0.285 |
| -0.17074735895300686 | -0.949 |
| -0.4480601998059772 | 0.378 |
| -0.01312829351963929 | 0.697 |
| -0.986013692552705 | 0.046 |
| -0.6467420184226755 | -0.512 |
| -0.27890052186710057 | -0.845 |
| -0.1540952566837459 | -0.523 |
| -0.8210956439592452 | -0.714 |
| 0.010871205356760116 | 0.635 |
| 0.32388601987097454 | 0.462 |
| 0.6073180901698101 | -0.366 |
| 0.5625673537406706 | -0.213 |
| -0.4995950942509353 | 0.915 |
| 0.31650212404836964 | 0.424 |
| -0.813420795657509 | -0.202 |
| -0.5982195335811806 | -0.333 |
| -0.5103115103944236 | -0.621 |
| -0.4331704951758226 | -0.27 |
| 0.789898897868567 | -0.559 |
| -0.6105253116041878 | 0.649 |
| 0.8674390110630992 | -0.572 |
| -0.7986693166821504 | 0.761 |
| -0.9003285042178966 | 0.574 |
| 0.7951299426630007 | 0.625 |
| 0.38588120975353557 | 0.271 |
| -0.058964316538011596 | -0.592 |
| 0.05629571908699327 | -0.655 |
| 0.6586757572446207 | 0.467 |
| -0.7274853636512999 | -0.161 |
| -0.6935708051242122 | 0.004 |
| -0.3225385463503576 | 0.409 |
| -0.548415813717243 | -0.098 |
| -0.16763883942136193 | -0.265 |
| 0.34660023708115784 | -0.017 |
| -0.8556085152018478 | -0.644 |
| -0.6381377294838151 | 0.068 |
| -0.0015603784718147828 | -0.293 |
| -0.8508789689107943 | -0.674 |
| 0.3458824436991179 | 0.675 |
| -0.6581461208790687 | 0.571 |
| -0.1287953368291499 | 0.745 |
| -0.06848274326811232 | 0.85 |
| -0.9091003415127761 | -0.943 |
| -0.6951890858529373 | -0.533 |
| 0.7960228480816041 | -0.142 |
| -0.9651397368898551 | -0.654 |
| 0.5581673398804947 | -0.679 |
| -0.06737632868280752 | 0.935 |
| 0.3227335440179486 | -0.461 |
| -0.7623621982261777 | 0.402 |
| -0.042163933235568996 | 0.785 |
| -0.4468354453278509 | -0.527 |
| -0.8467795241503195 | -0.682 |
| 0.5977043997309588 | -0.697 |
| 0.27819017938443436 | -0.753 |
| -0.43916569037824527 | -0.752 |
| -0.8433523460747643 | -0.537 |
| -0.3163045018025876 | 0.447 |
| 0.22901343130929463 | 0.794 |
| -0.8638780351988382 | 0.808 |
| 0.3668814689964208 | 0.184 |
| 0.7544672279993918 | -0.978 |
| -0.12912348600763268 | 0.328 |
| 0.6646709456626532 | -0.638 |
| 0.5105426103729307 | -0.555 |
| 0.20151318268014928 | -0.677 |
| -0.2800375756293292 | 0.474 |
| -0.6068793591655 | 0.512 |
| -0.65903066264501 | -0.138 |
| -0.5087922855645137 | 0.977 |
| 0.35668415289254285 | -0.852 |
| 0.9323781490316028 | 0.554 |
| -0.8698635735857305 | 0.781 |
| 0.5737738516768152 | -0.006 |
| 0.32406104089652077 | 0.925 |
| 0.09333508531430867 | -0.434 |
| -0.2389464599897324 | -0.805 |
| -0.5064172136336669 | 0.841 |
| -0.947624508765561 | 0.719 |
| -0.17457739660911198 | -0.912 |
| -0.023393359381983503 | 0.87 |
| 0.5811573459608033 | -0.977 |
| -0.160665243069831 | -0.702 |
| -0.7425533739880399 | -0.03 |
| -0.5188958958832177 | 0.348 |
| 0.26122819283056065 | -0.779 |
| -0.5785403736398886 | 0.489 |
| -0.5347611124901388 | -0.627 |
| -0.13246335654167884 | 0.158 |
| -0.1391609693327751 | -0.902 |
| 0.5399704989043921 | -0.872 |
| -0.8578114225582951 | 0.459 |
| 0.9658049223962204 | -0.603 |
| 0.8292143096916889 | -0.742 |
| 0.738615047580879 | 0.911 |
| 0.3092149022511592 | -0.347 |
| 0.354258813915046 | 0.233 |
| -0.13176208674039835 | -0.269 |
| 0.9130818990202307 | 0.719 |
| -0.8595730110496806 | 0.505 |
| 0.4840191056686318 | 0.948 |
| 0.6999833983931529 | -0.38 |
| 0.43695378010387964 | -0.499 |
| 0.2388880032268592 | -0.961 |
| 0.4593469890313746 | 0.588 |
| -0.8458681395509653 | 0.096 |
| 0.07216348466881572 | 0.642 |
| 0.8689006870483649 | -0.852 |
| 0.1829903493603835 | 0.956 |
| -0.8381316504513292 | 0.786 |
| -0.3675685798343047 | -0.942 |
| 0.8238828982576605 | -0.249 |
| 0.05063178647851663 | 0.062 |
| -0.11562877891223189 | 0.985 |
| -0.24764723252876863 | -0.048 |
| -0.8956930084899604 | 0.41 |
| -0.9313761107720986 | 0.513 |
| -0.062432828895827575 | -0.203 |
| -0.9285910303621083 | -0.599 |
| -0.39666468397103993 | -0.267 |
| 0.14357087516593636 | -0.646 |
| 0.9074745724677256 | 0.907 |
| -0.7489155772746563 | 0.373 |
| -0.8605591529447885 | 0.51 |
| 0.7050280755523799 | 0.931 |
| 0.6085019854228335 | 0.57 |
| -0.3272514406809879 | -0.375 |
| 0.6481659102537456 | 0.827 |
| -0.4498687326907673 | -0.512 |
| 0.5769456299408247 | -0.789 |
| -0.32844270148102805 | 0.572 |
| 0.031178051245582816 | 0.633 |
| 0.5956459006132881 | 0.62 |
| -0.3684452089175101 | -0.526 |
| -0.8597651584116335 | -0.174 |
| -0.599512431156265 | -0.557 |
| 0.5094195865116833 | 0.918 |
| 0.866823494553081 | 0.563 |
| -0.9608693804783324 | -0.903 |
| -0.36539713478351854 | -0.619 |
| 0.6807744603567152 | -0.057 |
| 0.5644765224023998 | 0.317 |
| -0.08784414197279267 | 0.474 |
| -0.8983176411400351 | -0.61 |
| -0.7955070830854185 | -0.834 |
| -0.7647268964019851 | 0.14 |
| -0.5979006588760958 | -0.842 |
| 0.8162770648445394 | 0.473 |
| 0.6358389066033199 | -0.336 |
| 0.008017816705627956 | -0.278 |
| -0.3443008121522648 | -0.156 |
| 0.34932813420182485 | 0.708 |
| 0.5018610944468744 | 0.983 |
| 0.9365767641873772 | -0.776 |
| 0.977799856182686 | 0.276 |
| -0.06419463269347014 | -0.321 |
| 0.5255992217149024 | 0.64 |
| -0.11229578251189021 | -0.492 |
| 0.7990862933585607 | -0.041 |
| -0.6211503916719545 | -0.475 |
| -0.7586667788119161 | 0.299 |
| -0.3482714236453799 | 0.689 |
| 0.6067518543230734 | -0.53 |
| 0.7595106312961544 | 0.546 |
| -0.29163774788994745 | 0.666 |
| -0.818308334086288 | 0.179 |
| -0.7419490856327333 | 0.792 |
| -0.05690380859102362 | -0.809 |
| -0.5676670340621386 | -0.699 |
| 0.44916497958292956 | 0.213 |
| 0.6671690695218198 | 0.844 |
| 0.9232943586889588 | 0.738 |
| -0.8753695644836017 | -0.341 |
| -0.9138749880992147 | 0.416 |
| -0.06959125568095081 | 0.095 |
| 0.7012916960053699 | -0.857 |
| 0.9938296609971093 | -0.586 |
| -0.14698052786109161 | -0.31 |
| -0.5233761096589189 | -0.367 |
| 0.7712752120166435 | 0.728 |
| -0.37309972909882205 | -0.503 |
| -0.33201118821022124 | -0.075 |
| 0.6856185126955934 | -0.083 |
| 0.31042862032851115 | -0.496 |
| -0.8249061194560265 | 0.999 |
| -0.06370630063429816 | -0.995 |
| -0.6274959992975035 | -0.882 |
| 0.19697900279986036 | 0.23 |
| 0.15396648321539352 | 0.622 |
| 0.1737850413538815 | -0.459 |
| 0.2193824610404045 | 0.305 |
| -0.847422706816074 | -0.063 |
| 0.6222172569179762 | -0.691 |
| 0.7791023851326366 | -0.682 |
| 0.7612191135815105 | -0.489 |
| -0.2100031113942471 | 0.095 |
| 0.2809117059704238 | -0.781 |
| 0.6689981370246878 | -0.095 |
| 0.3429714803326902 | 0.738 |
| -0.06951043889292907 | 0.533 |
| -0.6644269865735675 | -0.483 |
| 0.7065744523725921 | -0.814 |
| -0.2134534932282668 | -0.077 |
| 0.3059637910183426 | 0.657 |
| 0.36547742445787956 | 0.895 |
| 0.4030238489394593 | -0.931 |
| 0.5622413875479588 | -0.273 |
| -0.4303193501929108 | 0.522 |
| 0.6994235797359218 | 0.693 |
| 0.9455983101475998 | 0.109 |
| -0.6281641595414111 | 0.194 |
| 0.7725363942823493 | 0.327 |
| 0.5784483236087272 | 0.094 |
| 0.9475255006338197 | -0.285 |
| 0.7428772547298252 | 0.476 |
| -0.6338463696159504 | 0.318 |
| 0.5132841612160568 | -0.517 |
| 0.81717271127979 | 0.522 |
| 0.4859953457218007 | 0.115 |
| 0.6554974579839135 | 0.056 |
| 0.2528263483572537 | -0.777 |
| 0.1432720088145294 | -0.344 |
| 0.16605960652737273 | -0.586 |
| 0.637445353333751 | 0.657 |
| -0.717127659619563 | -0.975 |
| 0.6139998921711578 | -0.476 |
| 0.022062604092169202 | 0.048 |
| -0.5355286919433357 | -0.371 |
| 0.005778567618817343 | -0.196 |
| -0.38911463118700906 | -0.211 |
| -0.3287517523804202 | -0.925 |
| 0.19067360795108423 | 0.678 |
| 0.13096879350109703 | 0.057 |
| -0.4312138629636113 | -0.962 |
| 0.7262214161682952 | 0.18 |
| -0.8828422750497673 | 0.071 |
| 0.9469914230883205 | -0.642 |
| 0.6967122307887541 | -0.866 |
| -0.3860267637040662 | -0.994 |
| -0.4801294939785039 | -0.335 |
| 0.6971750123550895 | -0.243 |
| -0.5083943055608551 | -0.624 |
| -0.9640773405498477 | -0.662 |
| -0.7289089399710951 | 0.421 |
| 0.33013193534690366 | 0.629 |
| 0.5811521975842318 | 0.544 |
| -0.44921507957108964 | 0.236 |
| 0.46838449043629105 | -0.094 |
| 0.1497086991967611 | 0.674 |
| 0.529278060264113 | 0.852 |
| 0.7250314590684186 | 0.952 |
| -0.6814264356179303 | 0.599 |
| -0.09177121293354129 | -0.899 |
| -0.43435863334675795 | 0.968 |
| 0.06326446305839895 | 0.91 |
| 0.8409141495911068 | 0.596 |
| -0.7656209793671267 | 0.058 |
| -0.48919056308348075 | 0.177 |
| -0.3166648526339042 | 0.329 |
| -0.375656299767853 | -0.475 |
| 0.977362325225577 | 0.919 |
| -0.674661180151717 | -0.005 |
| 0.7930307155231993 | -0.1 |
| 0.4368814898943978 | 0.85 |
| -0.7661531364506273 | -0.021 |
| -0.0406543138590747 | -0.06 |
| -0.7973788028992208 | 0.635 |
| 0.08890978695687957 | 0.516 |
| -0.21488084620090908 | 0.26 |
| -0.34343175774664236 | -0.335 |
| 0.5891454203424229 | -0.325 |
| -0.22606298502636868 | -0.766 |
| -0.4180607196063526 | 0.019 |
| -0.9260015402070132 | -0.995 |
| 0.10262485794159049 | 0.862 |
| -0.7946549158599674 | 0.798 |
| 0.48033694013851314 | 0.823 |
| -0.8879194202854992 | -0.924 |
| -0.5979796059486475 | -0.652 |
| -0.6305579478231984 | -0.331 |
| -0.269773919172279 | 0.921 |
| -0.6233717753850452 | 0.472 |
| 0.12494769648920889 | -0.467 |
| -0.5095973558842808 | 0.915 |
| -0.5722617865313651 | 0.225 |
| -0.7018848454805364 | -0.578 |
| -0.5480016146548836 | 0.257 |
| 0.012690196750005933 | 0.731 |
| -0.46660331867268323 | 0.547 |
| -0.45791250072932277 | 0.047 |
| 0.272645830987851 | 0.903 |
| -0.6762950966416388 | -0.327 |
| -0.39007685162276085 | -0.497 |
| 0.35889274764255186 | -0.049 |
| 0.5745689292789238 | -0.492 |
| -0.2329014668261573 | -0.92 |
| 0.9903888679971213 | 0.004 |
| -0.7759028372373098 | -0.057 |
| 0.9450524331247667 | 0.238 |
| 0.13229102294862316 | 0.897 |
| -0.7224430350360129 | 0.761 |
| 0.5484023823273698 | -0.743 |
| -0.6195373446067645 | -0.44 |
| 0.9237032554201321 | 0.144 |
| 0.8522829220596015 | 0.968 |
| -0.733586806008425 | 0.908 |
| 0.9846208812990753 | -0.219 |
| -0.06267324596600932 | -0.307 |
| -0.11631001450191514 | -0.932 |
| -0.9365727121456282 | 0.645 |
| 0.07173709262622929 | -0.595 |
| 0.1496546268343073 | -0.723 |
| 0.10820350457234795 | -0.219 |
| -0.22463697319561216 | -0.504 |
| -0.5624625281792792 | 0.636 |
| 0.5580024787473374 | -0.098 |
| -0.5565701273761381 | -0.979 |
| -0.5559372082814906 | -0.851 |
| -0.8253709276996628 | -0.044 |
| -0.4889388978933067 | -0.451 |
| 0.4774080552267812 | -0.092 |
| -0.9517892052741679 | -0.455 |
| -0.6779021050512661 | -0.34 |
| -0.7959197803299434 | 0.134 |
| -0.605683029246902 | -0.827 |
| -0.08243112829461707 | -0.996 |
| -0.23732694505600382 | 0.042 |
| 0.6054124075603777 | -0.387 |
| -0.530917279187098 | 0.113 |
| -0.38140420131638786 | -0.191 |
| -0.606093384241128 | -0.146 |
| 0.583955680293933 | -0.142 |
| 0.5800130082609107 | -0.126 |
| 0.9166193644846432 | 0.34 |
| 0.38646889443692944 | -0.622 |
| 0.8088108945336541 | -0.214 |
| -0.15164763539362114 | 0.419 |
| -0.2643806473138419 | 0.046 |
| 0.42781839231987995 | -0.391 |
| 0.06812160906135079 | -0.07 |
| 0.3070155554619809 | -0.42 |
| 0.7168856342079055 | 0.665 |
| -0.3495617753171232 | -0.412 |
| -0.504225874265394 | -0.439 |
| -0.8054348616271936 | 0.847 |
| 0.5625976662761327 | 0.477 |
| 0.37667651509448463 | -0.002 |
| -0.4564773994616107 | 0.56 |
| -0.25511434750321915 | -0.482 |
| 0.04952881384577146 | -0.187 |
| 0.19888479548903804 | 0.814 |
| 0.13130847550385472 | 0.393 |
| 0.2237089997169417 | -0.597 |
| -0.9360125293081487 | 0.409 |
| 0.8226498160855427 | 0.461 |
| 0.2903839331941436 | 0.72 |
| -0.7396390894261882 | 0.05 |
| 0.49467474098072484 | 0.703 |
| -0.5707566774855675 | -0.739 |
| -0.22702622059816924 | -0.919 |
| 0.9292940089393056 | -0.241 |
| -0.8941367135344789 | 0.823 |
| 0.8148046922091101 | -0.996 |
| -0.09573040311564252 | -0.434 |
| -0.8511809340921446 | 0.411 |
| 0.4363337118893087 | 0.436 |
| 0.188879307242799 | -0.458 |
| -0.7182557179022209 | -0.517 |
| -0.5785643443701021 | -0.385 |
| -0.2030152746911471 | 0.776 |
| 0.1482295178262747 | 0.912 |
| -0.5598149883874877 | 0.241 |
| 0.2631472658425462 | -0.094 |
| 0.5374110626780582 | 0.143 |
| 0.5337144106394704 | 0.315 |
| -0.9749565779073324 | 0.238 |
| -0.47435545340697716 | -0.134 |
| -0.0827242968616162 | 0.256 |
| 0.6094827871347674 | 0.361 |
| 0.6428960743916459 | 0.188 |
| -0.8718161767272035 | -0.544 |
| -0.8744717290221391 | -0.827 |
| -0.20329368427336525 | 0.644 |
| 0.8948868194107129 | 0.654 |
| -0.8765577079573836 | 0.652 |
| -0.8040324880914711 | -0.766 |
| 0.24666309777825424 | 0.254 |
| -0.024175208055925657 | 0.995 |
| 0.6443832345450953 | 0.609 |
| -0.3093544416380676 | -0.591 |
| -0.06492118455628315 | 0.08 |
| 0.6801774678311028 | -0.973 |
| -0.3142426293952092 | 0.556 |
| -0.9319628915977201 | -0.525 |
| 0.3716480475047088 | 0.363 |
| -0.8470550611118357 | 0.35 |
| 0.8035566970014576 | -0.813 |
| 0.003640783226558808 | 0.037 |
| 0.7672996778776191 | 0.514 |
| 0.6866961549012802 | 0.187 |
| -0.6655643304720342 | 0.288 |
| 0.4180115321845759 | -0.216 |
| -0.24089930425671136 | -0.325 |
| -0.5523897971329488 | 0.843 |
| -0.6031690307182029 | -0.356 |
| 0.3890780902168893 | 0.207 |
| 0.8671531413555784 | 0.296 |
| 0.9715332151738236 | 0.617 |
| 0.21912362622347703 | -0.107 |
| 0.3222856081272818 | -0.306 |
| -0.00636254124933866 | -0.01 |
| 0.4809533294094206 | 0.227 |
| -0.575167122053363 | 0.741 |
| -0.07544744842065043 | -0.02 |
| -0.5493499841331841 | 0.489 |
| -0.9877469620879009 | 0.72 |
| -0.43725182986410327 | -0.974 |
| -0.6978007797656907 | -0.88 |
| 0.18691582548733998 | -0.574 |
| -0.34797762635456575 | -0.16 |
| 0.5522343080515546 | 0.815 |
| 0.8136367924487347 | 0.891 |
| -0.201448437514816 | 0.067 |
| -0.8905929782782069 | 0.123 |
| 0.1784357247083581 | -0.011 |
| -0.2908407954333794 | -0.44 |
| 0.09202512774972593 | 0.28 |
| -0.827200827500322 | 0.733 |
| -0.05305872375743781 | -0.082 |
| 0.06714518376870848 | -0.748 |
| 0.7531063439167021 | 0.627 |
| 0.598227755762403 | 0.722 |
| -0.414200841443892 | 0.216 |
| 0.26135073551152543 | -0.162 |
| -0.3011506107565469 | -0.083 |
| -0.07980257339012309 | 0.356 |
| 0.3830435232900491 | -0.237 |
| -0.3820229717428092 | 0.77 |
| -0.06067232149069146 | 0.82 |
| 0.7691571415927358 | 0.779 |
| -0.9132176869919295 | 0.388 |
| -0.21366761726448646 | -0.956 |
| -0.7273856274823101 | 0.883 |
| -0.009848919881430218 | 0.907 |
| 0.7460310968683916 | -0.404 |
| 0.3815872266287288 | -0.174 |
| -0.967306986429606 | 0.673 |
| -0.7029940269967891 | 0.783 |
| 0.34480976502594096 | -0.258 |
| -0.5853271753357434 | -0.936 |
| -0.07663037946467743 | -0.963 |
| -0.7341386278214996 | -0.793 |
| 0.2343555018949417 | 0.732 |
| 0.6925780742991496 | 0.44 |
| 0.49198679623155206 | -0.85 |
| 0.1377332672824816 | -0.351 |
| -0.35866170499576655 | 0.619 |
| 0.4214553974775319 | 0.677 |
| -0.9005044532117386 | -0.277 |
| -0.7424155439499245 | -0.216 |
| 0.9559444119748501 | 0.615 |
| -0.7658317612272945 | 0.569 |
| -0.5790668635014562 | -0.019 |
| -0.048047273546334646 | -0.157 |
| 0.5351497492523336 | -0.74 |
| -0.08414970082508777 | -0.602 |
| 0.33958934775869354 | 0.109 |
| 0.46186084394174 | 0.644 |
| -0.42868627137150317 | -0.791 |
| 0.5583523039978731 | 0.138 |
| 0.9592548147938726 | 0.192 |
| 0.4120906033733476 | 0.34 |
| 0.4218497118250022 | 0.694 |
| 0.8535166754500252 | -0.159 |
| 0.7015806285682649 | -0.983 |
| 0.555834621850563 | 0.26 |
| -0.7068488497686027 | 0.505 |
| -0.42429887499026053 | 0.099 |
| 0.3303133629045272 | -0.224 |
| 0.17871353468059725 | 0.69 |
| 0.3885587374662831 | -0.907 |
| 0.9792577599250036 | 0.589 |
| -0.10548766282936306 | 0.013 |
| 0.3400112724039477 | -0.558 |
| 0.858411366153818 | -0.1 |
| 0.20213563240400112 | -0.332 |
| 0.0590753429914701 | -0.207 |
| 0.022107418022831116 | -0.959 |
| 0.5487081721731528 | -0.386 |
| 0.5231977642225178 | -0.476 |
| -0.4039940080031075 | 0.549 |
| -0.3103555659225161 | -0.974 |
| -0.8899509619189832 | -0.374 |
| -0.42586795047159853 | 0.197 |
| 0.506983265532972 | -0.63 |
| 0.04374312278108827 | -0.413 |
| -0.008091949168190338 | 0.589 |
| -0.7198644168243016 | 0.156 |
| 0.25259037528142936 | 0.167 |
| 0.6741885342565399 | 0.451 |
| 0.9938674168651902 | 0.132 |
| -0.12669441035337559 | 0.676 |
| 0.29543333801077365 | -0.836 |
| -0.7379351609700497 | -0.128 |
| -0.1362749398166767 | 0.818 |
| -0.25296523743443955 | -0.389 |
| -0.36833351027104455 | -0.289 |
| -0.3901442360571472 | 0.162 |
| -0.14930619013819624 | 0.849 |
| -0.5004600668400607 | 0.993 |
| -0.5187875541557381 | -0.583 |
| -0.7161403151227899 | -0.013 |
| 0.7138614339319136 | -0.854 |
| -0.7285610519638721 | -0.98 |
| 0.5597880149717744 | 0.972 |
| 0.9357954696005182 | 0.258 |
| -0.3018873313056709 | -0.38 |
| 0.19651370937685564 | -0.148 |
| 0.15171308043559328 | 0.898 |
| 0.17906741703178608 | 0.894 |
| 0.4332121624225216 | -0.028 |
| -0.652479748258205 | 0.599 |
| 0.3592197908435846 | 0.426 |
| -0.07447486986753682 | -0.212 |
| 0.09315162521658449 | 0.34 |
| -0.6788754110619373 | 0.13 |
| 0.443422977759506 | -0.035 |
| -0.5979886306624971 | -0.472 |
| 0.12766889144059124 | 0.101 |
| -0.7408951215456729 | 0.649 |
| 0.7866595337537889 | -0.319 |
| 0.024032603868152647 | 0.307 |
| 0.43809599571630686 | 0.739 |
| 0.4141231263291816 | -0.049 |
| 0.03632858730788535 | 0.448 |
| -0.634747993405764 | 0.345 |
| -0.14784068345349288 | 0.619 |
| -0.6174122178398529 | -0.465 |
| -0.6152851477927646 | 0.701 |
| -0.008765956421147969 | -0.283 |
| -0.6571649297476181 | -0.267 |
| 0.24332821441680297 | 0.515 |
| -0.898295251675892 | 0.384 |
| 0.8272661036094813 | -0.253 |
| 0.48835644933137834 | -0.326 |
| -0.6908863873460611 | 0.753 |
| -0.3632067926204152 | -0.588 |
| 0.019358435850008293 | -0.402 |
| -0.13161710223586165 | -0.924 |
| -0.964200777663998 | -0.723 |
| -0.3818202661229393 | 0.999 |
| -0.6767871331519457 | -0.342 |
| 0.7232438866916657 | 0.729 |
| -0.3344184456287709 | -0.757 |
| -0.031843660888221104 | -0.305 |
| 0.252085830803622 | 0.806 |
| 0.7894621774628294 | 0.112 |
| -0.4229580711469165 | -0.919 |
| 0.25657628436264757 | -0.353 |
| -0.8779409805764702 | -0.122 |
| -0.36487958959571487 | -0.333 |
| -0.5015551154093552 | 0.691 |
| -0.410665808957271 | -0.98 |
| 0.9945846193748573 | 0.363 |
| 0.8812737250444858 | -0.339 |
| -0.6184429321736995 | -0.566 |
| -0.5785390411278515 | -0.079 |
| -0.8894556304601509 | 0.581 |
| -0.8068070042437254 | -0.525 |
| 0.9411920491765815 | -0.377 |
| -0.8981868701150149 | 0.395 |
| 0.23551050825554398 | 0.922 |
| -0.5530997258514192 | 0.34 |
| 0.12652739732376928 | -0.272 |
| -0.6854476320031784 | -0.624 |
| -0.9618372192919884 | 0.102 |
| 0.4461140616745338 | 0.371 |
| -0.5432166178372808 | -0.517 |
| -0.8666785735862521 | -0.416 |
| -0.9655694183185803 | -0.16 |
| 0.4418407261070898 | -0.729 |
| 0.5147350399506321 | 0.748 |
| -0.28108819890151726 | 0.897 |
| 0.2155889851032513 | 0.118 |
| 0.25072357869076667 | 0.727 |
| 0.5869321218777561 | -0.708 |
| -0.47755716868113374 | 0.619 |
| 0.6652001872313409 | -0.888 |
| -0.9653590049389886 | -0.402 |
| -0.7334760961263134 | -0.359 |
| 0.9120485192859906 | 0.888 |
| 0.08908229757224517 | -0.996 |
| 0.8880374140045375 | 0.984 |
| -0.15010194850920655 | 0.236 |
| -0.2625679951749431 | -0.32 |
| -0.08750235375293336 | 0.931 |
| -0.9873376364203947 | -0.263 |
| 0.3038740830628057 | -0.582 |
| -0.3034388179474181 | 1 |
| -0.46114709783495766 | -0.548 |
| 0.20837175646284045 | -0.241 |
| -0.5596811133389825 | -0.623 |
| 0.5287736360299147 | 0.976 |
| -0.007315558172724668 | 0.75 |
| -0.03344794389710448 | -0.855 |
| 0.7200113827698287 | -0.649 |
| -0.23815589132973658 | -0.281 |
| 0.8992569984904564 | 0.499 |
| -0.10415764696519103 | -0.516 |
| 0.01232253169514963 | 0.084 |
| -0.166971023970794 | -0.441 |
| 0.6541374708087777 | 0.368 |
| 0.27616883861739683 | 0.537 |
| 0.10017796607044738 | 0.239 |
| 0.14556610168259354 | -0.479 |
| 0.00010517817190169865 | -0.861 |
| -0.09257021238820595 | -0.082 |
| 0.29731778603816394 | -0.398 |
| 0.4832919365241479 | 0.037 |
| 0.41258260088281085 | -0.838 |
| -0.2210156947709001 | -0.203 |
| 0.02599010060124618 | 0.337 |
| 0.9620078486066699 | -0.494 |
| -0.6151661264342232 | -0.279 |
| 0.5039522112605461 | 0.138 |
| -0.9197803495535557 | -0.791 |
| 0.7834223777231293 | 0.672 |
| 0.6793034039516554 | 0.486 |
| -0.643862818642863 | 0.078 |
| 0.8693658066508725 | -0.766 |
| 0.04205019317058767 | -0.691 |
| 0.9795798321884275 | -0.848 |
| 0.6213248201487556 | 0.928 |
| -0.7102895474058526 | 0.111 |
| 0.5516489692935826 | -0.821 |
| 0.8118296855314615 | -0.769 |
| -0.0024927557636507114 | 0.189 |
| 0.11888023604128484 | 0.505 |
| -0.7727827921582768 | -0.054 |
| 0.10602231982636723 | -0.271 |
| 0.8616508098744589 | 0.506 |
| 0.528587588400528 | 0.717 |
| -0.3658219304928796 | 0.57 |
| -0.08249568808621577 | -0.214 |
| 0.09954560071838858 | -0.837 |
| -0.03756190428087125 | -0.906 |
| -0.8578784804168049 | -0.578 |
| -0.19735090807142064 | -0.478 |
| 0.4333590096513773 | 0.476 |
| -0.6076736372026492 | 0.847 |
| -0.8324158289082533 | 0.427 |
| 0.36766223975388046 | -0.531 |
| -0.9815256225809135 | 0.238 |
| -0.47919357611856883 | -0.911 |
| 0.4007783801279168 | 0.747 |
| -0.7643907421190195 | 0.477 |
| 0.44665084522981635 | 0.03 |
| -0.5382954677835656 | 0.254 |
| 0.9862861081304535 | -0.414 |
| -0.7479728131442256 | -0.2 |
| -0.6578779898705467 | 0.521 |
| 0.12468995521916293 | 0.704 |
| 0.5412846164556451 | 0.142 |
| 0.7895905046717535 | 0.038 |
| -0.2845302591599781 | -0.956 |
| 0.10634940084579525 | -0.078 |
| 0.7009902291698997 | 0.036 |
| 0.3784719231961753 | -0.96 |
| -0.9769560195516771 | -0.564 |
| 0.42093714407978156 | -0.616 |
| 0.06321720518574447 | 0.783 |
| 0.9988862240699359 | 0.431 |
| 0.9741330472422265 | -0.787 |
| -0.01232577407066282 | 0.534 |
| -0.7952373688440808 | -0.302 |
| -0.3364795364938846 | 0.424 |
| -0.7648265677553576 | 0.049 |
| -0.23274213806260202 | -0.096 |
| -0.5141159305367489 | 0.402 |
| 0.3949572290923695 | -0.487 |
| -0.9152354917658083 | 0.196 |
| -0.0725846418922389 | -0.601 |
| -0.06687824570113987 | 0.633 |
| 0.12514934758666119 | -0.228 |
| 0.15503133128368818 | -0.965 |
| -0.02108483080672885 | -0.873 |
| -0.9954534577762817 | -0.343 |
| -0.6045810799545339 | 0.067 |
| -0.6803649925745565 | 0.12 |
| 0.9660798745745045 | -0.321 |
| 0.926439208196532 | 0.346 |
| 0.7082670388912102 | -0.899 |
| 0.46998994586818754 | 0.535 |
| -0.5222215910798933 | -0.261 |
| 0.16413201047427828 | -0.19 |
| 0.7010883360079352 | 0.346 |
| -0.8060978979367683 | -0.481 |
| 0.6367402677933764 | -0.532 |
| 0.05605172157433702 | -0.669 |
| 0.1419967843838985 | 0.08 |
| -0.589779670229706 | -0.263 |
| -0.2106125927061553 | 0.519 |
| 0.5907364202428786 | 0.454 |
| -0.585969450622005 | 0.611 |
| -0.623858852550746 | -0.784 |
| -0.3463456504085214 | -0.064 |
| 0.6530351263591143 | -0.407 |
| 0.41352978804970486 | -0.315 |
| -0.9179905610352828 | 0.614 |
| 0.08433389737209862 | -0.938 |
| -0.8216329996355918 | 0.239 |
| 0.9212093659257852 | 0.431 |
| -0.7398820031361764 | -0.281 |
| 0.9857835175434662 | -0.596 |
| 0.5383487786908652 | -0.115 |
| -0.9090149947404029 | -0.004 |
| -0.11224769051695915 | -0.552 |
| 0.7447850752573817 | 0.071 |
| -0.588808564216051 | 0.146 |
| 0.2869253932974314 | 0.295 |
| -0.12764150750055792 | -0.63 |
| -0.7177226068556917 | 0.215 |
| -0.5549924445116559 | 0.907 |
| -0.7227888227825363 | 0.197 |
| -0.6385407003574324 | 0.111 |
| -0.2147364723013836 | 0.164 |
| -0.5514499203518795 | 0.85 |
| -0.19742554890424313 | 0.415 |
| 0.41786233732568023 | 0.36 |
| -0.3266821884468596 | -0.785 |
| 0.9448456781246601 | 0.325 |
| -0.05355138778099633 | -0.504 |
| 0.8805070152435679 | -0.386 |
| 0.2379598196613335 | -0.4 |
| -0.6667525054750312 | -0.27 |
| 0.2537629348307433 | -0.537 |
| -0.19232690138689712 | 0.955 |
| -0.6151879184124407 | 0.575 |
| -0.8222617342873533 | -0.351 |
| 0.6603211885293923 | 0.012 |
| -0.16499769137219866 | -0.267 |
| 0.43291050885102256 | -0.784 |
| -0.4219578984974883 | 0.659 |
| 0.8857535334370896 | 0.917 |
| 0.0019753910291682164 | 0.561 |
| 0.7569791349846207 | -0.187 |
| 0.0957439966043303 | 0.886 |
| 0.9332607995851123 | 0.315 |
| -0.4019419129062034 | -0.241 |
| 0.3219578075299141 | 0.281 |
| 0.577363264102537 | 0.678 |
| -0.5371533344955319 | 0.762 |
| 0.7213557494247889 | 0.375 |
| -0.5405206021932334 | -0.286 |
| 0.9047754645457731 | -0.244 |
| -0.17322955297225406 | -0.941 |
| 0.5542083183914335 | 0.036 |
| 0.7795834617424044 | 0.197 |
| 0.020849831618843906 | 0.864 |
| -0.5572190635992562 | 0.461 |
| -0.29470867762108766 | -0.933 |
| -0.8267528653715672 | 0.476 |
| -0.44725086954657756 | 0.489 |
| -0.9638738083059664 | -0.603 |
| 0.08255139291405289 | 0.246 |
| 0.11981361735653784 | 0.313 |
| -0.22999781772533123 | -0.594 |
| 0.8608435170040731 | -0.185 |
| 0.299353275691274 | -0.48 |
| -0.8031713665535636 | 0.048 |
| -0.20296288277904884 | -0.335 |
| -0.9451772939511653 | -0.833 |
| 0.8336267467103977 | -0.865 |
| 0.5281418467006516 | 0.082 |
| 0.12166572339151749 | -0.115 |
| 0.5739006473582247 | -0.668 |
| -0.7832975963052737 | -0.013 |
| 0.6884931778487484 | 0.204 |
| 0.7333570673527816 | -0.817 |
| 0.6818009145915829 | -0.389 |
| 0.920979549436119 | 0.855 |
| 0.7834848554373466 | 0.202 |
| 0.877770018211431 | -0.557 |
| 0.9878694421917484 | 0.859 |
| -0.4154588083325996 | -0.038 |
| -0.16260070468004728 | -0.886 |
| 0.22424906960414925 | -0.725 |
| -0.8870504346994164 | -0.913 |
| -0.9689349874463264 | 0.636 |
| 0.9182207502228812 | -0.046 |
| -0.5591133557094643 | 0.31 |
| -0.13490304267853093 | -0.103 |
| 0.11033797946109702 | 0.389 |
| -0.197528892300745 | -0.369 |
| -0.9100757578980114 | -0.567 |
| 0.6350286735313873 | 0.104 |
| -0.22379158421164336 | -0.554 |
| -0.6477248360655277 | -0.515 |
| 0.014025956319364985 | 0.238 |
| 0.7892159391349258 | -0.481 |
| -0.7236356522802656 | -0.004 |
| 0.7426156266149182 | 0.066 |
| -0.3387733623762412 | -0.347 |
| 0.004626145754760502 | -0.462 |
| -0.0006357071191582797 | -0.365 |
| -0.12856233834716102 | -0.523 |
| -0.34585980554946505 | -0.513 |
| -0.8262516279622583 | -0.416 |
| -0.754854436893893 | 0.008 |
| -0.364919496845423 | 0.286 |
| -0.9995210841185167 | 0.973 |
| -0.37455230664571904 | -0.79 |
| 0.31758961338112424 | -0.144 |
| -0.6658025487724324 | -0.908 |
| -0.627255616284671 | 0.605 |
| -0.0372522867309244 | 0.549 |
| 0.43280341185789895 | -0.574 |
| -0.4426766687789161 | -0.261 |
| -0.26559686107462066 | 0.077 |
| 0.5011902720260459 | 0.132 |
| -0.09193978575211759 | -0.26 |
| -0.4203269976954014 | -0.051 |
| 0.31990624132116174 | 0.822 |
| -0.9450728280962284 | 0.297 |
| 0.8839273084204431 | -0.596 |
| -0.9243180410159391 | 0.942 |
| 0.2773909051736856 | -0.509 |
| -0.6694429217161313 | 0.259 |
| -0.7188183681681517 | -0.64 |
| -0.35051539828538947 | 0.445 |
| -0.4123896579747204 | 0.149 |
| -0.9834533759983122 | 0.645 |
| -0.04057894988762767 | -0.156 |
| 0.4918514299765542 | 0.82 |
| -0.6359923989637661 | 0.648 |
| 0.9909833604199318 | -0.918 |
| 0.8107524296650803 | -0.972 |
| -0.953737856443317 | 0.588 |
| 0.78693586391714 | -0.235 |
| 0.12916159609064692 | 0.832 |
| -0.5077743662593583 | 0.478 |
| 0.6358961515340553 | 0.705 |
| -0.24130179974740584 | -0.968 |
| 0.623221674334719 | -0.794 |
| 0.030398076130002005 | -0.785 |
| 0.04046126253806448 | -0.67 |
| -0.569605375183798 | -0.12 |
| -0.23102165354983062 | 0.752 |
| -0.76089691798386 | 0.309 |
| 0.9727498495925175 | 0.448 |
| 0.3254018066296325 | -0.325 |
| 0.7812963391291354 | -0.285 |
| -0.9832534192698286 | 0.81 |
| -0.9103083939544776 | -0.586 |
| 0.6507881107200402 | -0.382 |
| -0.11726910395403545 | -0.199 |
| 0.8975278704990708 | -0.872 |
| -0.4961369780922662 | -0.454 |
| 0.5646802218531599 | -0.407 |
| 0.7805905467614747 | 0.975 |
| 0.19956263726447254 | -0.027 |
| 0.3405957178554455 | 0.075 |
| 0.5604516539686908 | 0.69 |
| 0.999355783055252 | -0.372 |
| 0.36891485968972804 | -0.366 |
| 0.4566298095611627 | 0.239 |